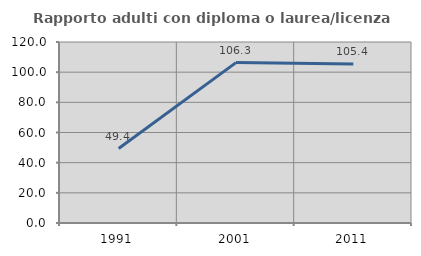
| Category | Rapporto adulti con diploma o laurea/licenza media  |
|---|---|
| 1991.0 | 49.367 |
| 2001.0 | 106.329 |
| 2011.0 | 105.435 |